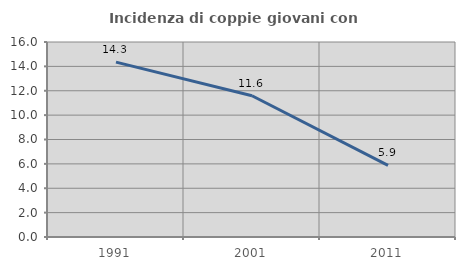
| Category | Incidenza di coppie giovani con figli |
|---|---|
| 1991.0 | 14.347 |
| 2001.0 | 11.591 |
| 2011.0 | 5.882 |